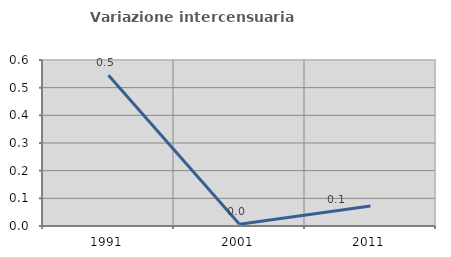
| Category | Variazione intercensuaria annua |
|---|---|
| 1991.0 | 0.545 |
| 2001.0 | 0.007 |
| 2011.0 | 0.072 |